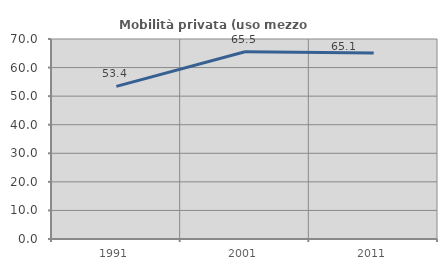
| Category | Mobilità privata (uso mezzo privato) |
|---|---|
| 1991.0 | 53.417 |
| 2001.0 | 65.514 |
| 2011.0 | 65.076 |